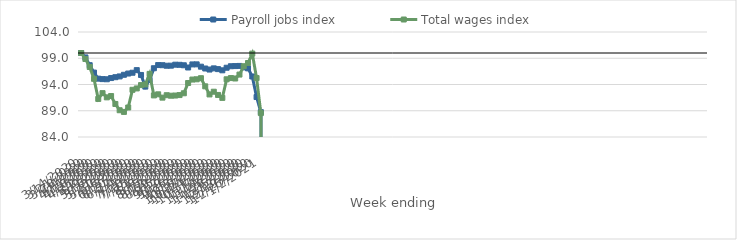
| Category | Payroll jobs index | Total wages index |
|---|---|---|
| 14/03/2020 | 100 | 100 |
| 21/03/2020 | 99.156 | 98.86 |
| 28/03/2020 | 97.681 | 97.34 |
| 04/04/2020 | 96.27 | 95.084 |
| 11/04/2020 | 95.113 | 91.251 |
| 18/04/2020 | 95.028 | 92.352 |
| 25/04/2020 | 94.998 | 91.552 |
| 02/05/2020 | 95.228 | 91.801 |
| 09/05/2020 | 95.39 | 90.292 |
| 16/05/2020 | 95.538 | 89.097 |
| 23/05/2020 | 95.85 | 88.778 |
| 30/05/2020 | 96.086 | 89.618 |
| 06/06/2020 | 96.241 | 92.99 |
| 13/06/2020 | 96.737 | 93.252 |
| 20/06/2020 | 95.818 | 93.885 |
| 27/06/2020 | 93.6 | 94.012 |
| 04/07/2020 | 94.852 | 96.022 |
| 11/07/2020 | 97.1 | 91.922 |
| 18/07/2020 | 97.701 | 92.128 |
| 25/07/2020 | 97.678 | 91.5 |
| 01/08/2020 | 97.573 | 91.96 |
| 08/08/2020 | 97.586 | 91.863 |
| 15/08/2020 | 97.773 | 91.898 |
| 22/08/2020 | 97.748 | 91.986 |
| 29/08/2020 | 97.662 | 92.328 |
| 05/09/2020 | 97.24 | 94.285 |
| 12/09/2020 | 97.825 | 94.942 |
| 19/09/2020 | 97.838 | 94.993 |
| 26/09/2020 | 97.393 | 95.201 |
| 03/10/2020 | 97.048 | 93.648 |
| 10/10/2020 | 96.848 | 92.109 |
| 17/10/2020 | 97.073 | 92.626 |
| 24/10/2020 | 96.931 | 92.01 |
| 31/10/2020 | 96.704 | 91.453 |
| 07/11/2020 | 97.193 | 94.993 |
| 14/11/2020 | 97.48 | 95.226 |
| 21/11/2020 | 97.51 | 95.145 |
| 28/11/2020 | 97.537 | 95.891 |
| 05/12/2020 | 97.254 | 97.48 |
| 12/12/2020 | 97.074 | 98.094 |
| 19/12/2020 | 95.525 | 99.886 |
| 26/12/2020 | 91.61 | 95.225 |
| 02/01/2021 | 88.732 | 88.548 |